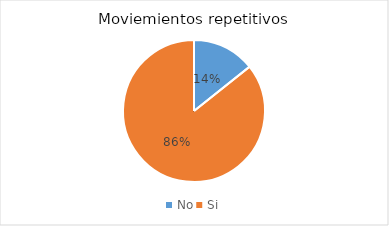
| Category | Series 0 |
|---|---|
| No | 1 |
| Si | 6 |